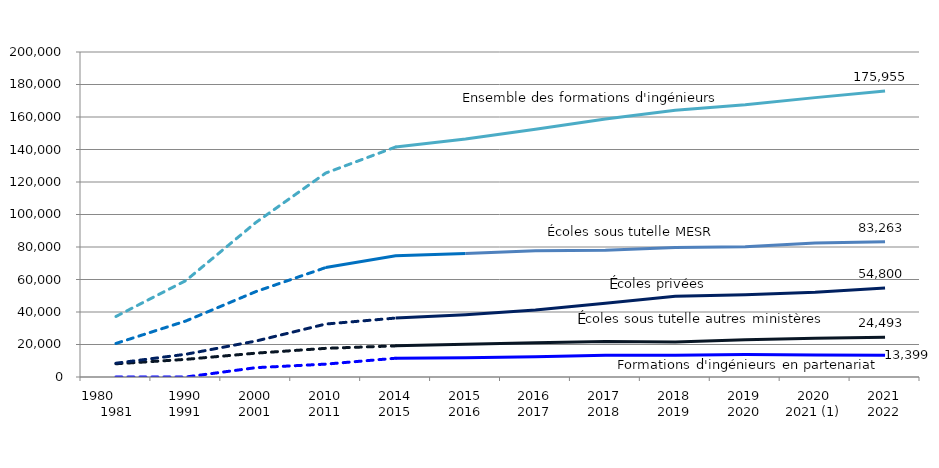
| Category | Écoles sous tutelle du MESR | Écoles sous tutelle d'un autre ministère ou d'une collectivité locale | Écoles privées | Formations d’ingénieurs en partenariat (FIP) | Ensemble des formations d'ingénieurs |
|---|---|---|---|---|---|
| 1980          1981 | 20650 | 8127 | 8490 | 0 | 37267 |
| 1990
1991 | 34475 | 10865 | 14002 | 0 | 59342 |
| 2000
2001 | 52537 | 14670 | 22106 | 5741 | 95054 |
| 2010
2011 | 67353 | 17643 | 32586 | 7919 | 125501 |
| 2014
2015 | 74566 | 19165 | 36272 | 11543 | 141546 |
| 2015
2016 | 75975 | 20211 | 38337 | 11909 | 146432 |
| 2016
2017 | 77700 | 21022 | 41275 | 12508 | 152505 |
| 2017
2018 | 77977 | 21894 | 45451 | 13452 | 158774 |
| 2018
2019 | 79764 | 21474 | 49618 | 13321 | 164177 |
| 2019
2020 | 80230 | 22913 | 50615 | 13789 | 167547 |
| 2020
2021 (1) | 82435 | 23791 | 52091 | 13608 | 171925 |
| 2021
2022 | 83263 | 24493 | 54800 | 13399 | 175955 |